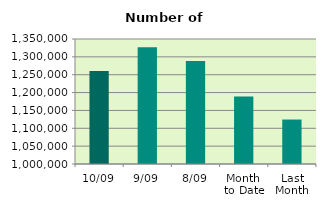
| Category | Series 0 |
|---|---|
| 10/09 | 1260626 |
| 9/09 | 1326840 |
| 8/09 | 1288602 |
| Month 
to Date | 1189298.5 |
| Last
Month | 1124493.364 |